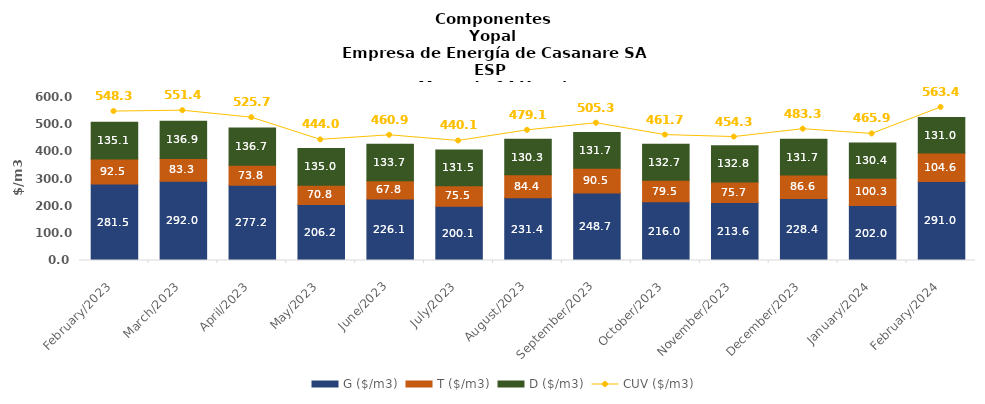
| Category | G ($/m3) | T ($/m3) | D ($/m3) |
|---|---|---|---|
| 2023-02-01 | 281.451 | 92.545 | 135.074 |
| 2023-03-01 | 292.028 | 83.345 | 136.946 |
| 2023-04-01 | 277.158 | 73.848 | 136.749 |
| 2023-05-01 | 206.218 | 70.832 | 134.954 |
| 2023-06-01 | 226.097 | 67.766 | 133.705 |
| 2023-07-01 | 200.103 | 75.481 | 131.466 |
| 2023-08-01 | 231.393 | 84.415 | 130.283 |
| 2023-09-01 | 248.694 | 90.492 | 131.705 |
| 2023-10-01 | 216.024 | 79.542 | 132.704 |
| 2023-11-01 | 213.555 | 75.682 | 132.796 |
| 2023-12-01 | 228.438 | 86.567 | 131.735 |
| 2024-01-01 | 202.024 | 100.31 | 130.386 |
| 2024-02-01 | 291.046 | 104.565 | 131.038 |